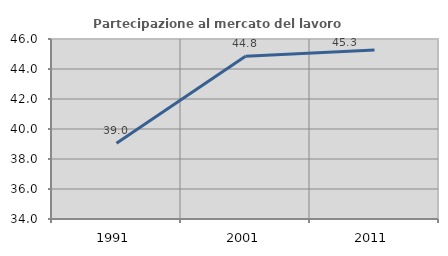
| Category | Partecipazione al mercato del lavoro  femminile |
|---|---|
| 1991.0 | 39.046 |
| 2001.0 | 44.848 |
| 2011.0 | 45.269 |